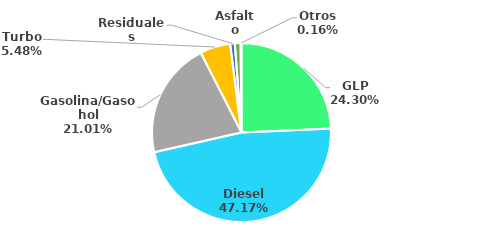
| Category | MBPD |
|---|---|
| GLP | 60.633 |
| Diesel | 117.717 |
| Gasolina/Gasohol | 52.434 |
| Turbo | 13.678 |
| Residuales | 2.089 |
| Asfalto | 2.595 |
| Otros | 0.396 |